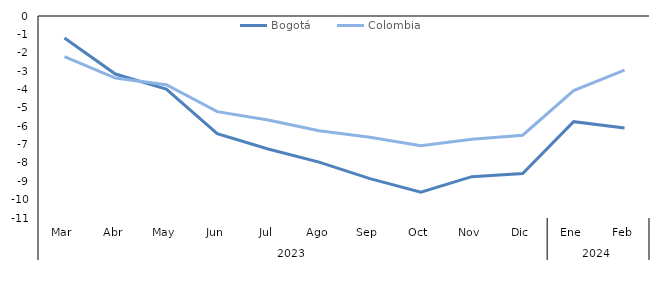
| Category | Bogotá | Colombia |
|---|---|---|
| 0 | -1.201 | -2.211 |
| 1 | -3.16 | -3.381 |
| 2 | -3.978 | -3.746 |
| 3 | -6.408 | -5.21 |
| 4 | -7.241 | -5.668 |
| 5 | -7.956 | -6.247 |
| 6 | -8.856 | -6.597 |
| 7 | -9.592 | -7.059 |
| 8 | -8.749 | -6.712 |
| 9 | -8.581 | -6.492 |
| 10 | -5.753 | -4.06 |
| 11 | -6.097 | -2.944 |